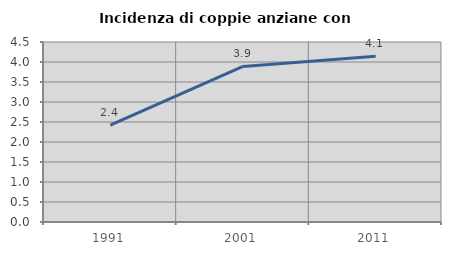
| Category | Incidenza di coppie anziane con figli |
|---|---|
| 1991.0 | 2.424 |
| 2001.0 | 3.89 |
| 2011.0 | 4.143 |